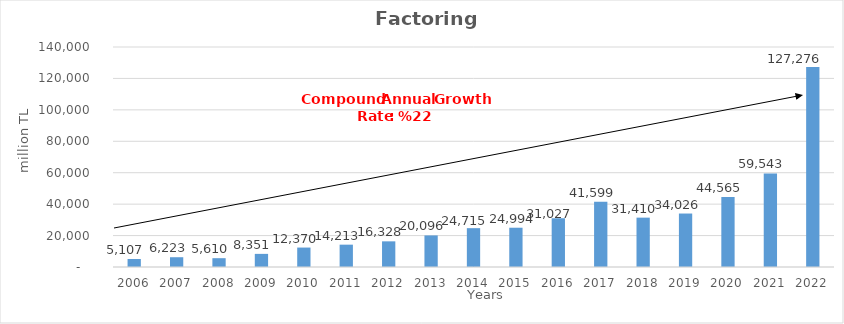
| Category | Factoring |
|---|---|
| 2006.0 | 5107.149 |
| 2007.0 | 6222.508 |
| 2008.0 | 5610.293 |
| 2009.0 | 8350.82 |
| 2010.0 | 12369.836 |
| 2011.0 | 14213.285 |
| 2012.0 | 16327.829 |
| 2013.0 | 20095.909 |
| 2014.0 | 24715 |
| 2015.0 | 24994 |
| 2016.0 | 31027 |
| 2017.0 | 41599 |
| 2018.0 | 31410 |
| 2019.0 | 34026 |
| 2020.0 | 44565 |
| 2021.0 | 59543 |
| 2022.0 | 127276 |